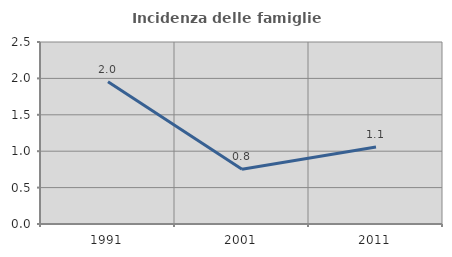
| Category | Incidenza delle famiglie numerose |
|---|---|
| 1991.0 | 1.956 |
| 2001.0 | 0.751 |
| 2011.0 | 1.059 |